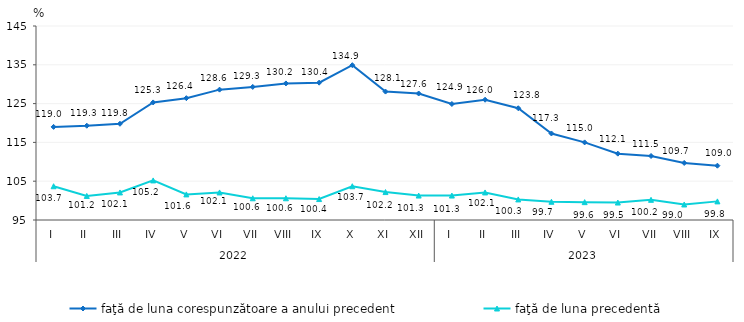
| Category | faţă de luna corespunzătoare a anului precedent | faţă de luna precedentă   |
|---|---|---|
| 0 | 119 | 103.7 |
| 1 | 119.3 | 101.2 |
| 2 | 119.8 | 102.1 |
| 3 | 125.3 | 105.2 |
| 4 | 126.4 | 101.6 |
| 5 | 128.6 | 102.1 |
| 6 | 129.3 | 100.6 |
| 7 | 130.2 | 100.6 |
| 8 | 130.4 | 100.4 |
| 9 | 134.9 | 103.7 |
| 10 | 128.1 | 102.2 |
| 11 | 127.6 | 101.3 |
| 12 | 124.9 | 101.3 |
| 13 | 126 | 102.1 |
| 14 | 123.8 | 100.3 |
| 15 | 117.3 | 99.7 |
| 16 | 115 | 99.6 |
| 17 | 112.1 | 99.5 |
| 18 | 111.5 | 100.2 |
| 19 | 109.7 | 99 |
| 20 | 109 | 99.8 |